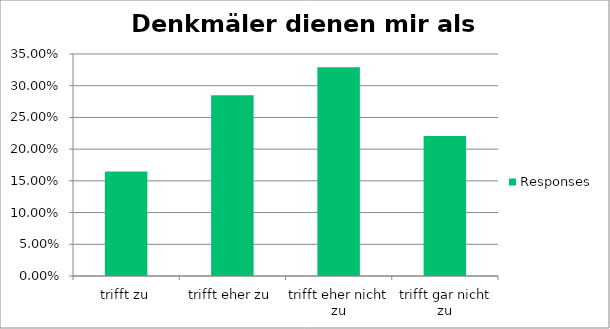
| Category | Responses |
|---|---|
| trifft zu | 0.165 |
| trifft eher zu | 0.285 |
| trifft eher nicht zu | 0.329 |
| trifft gar nicht zu | 0.221 |